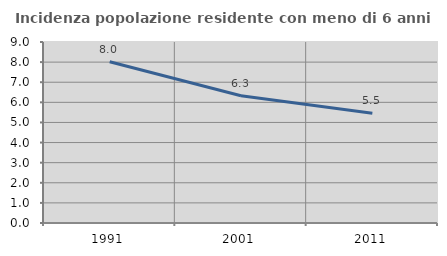
| Category | Incidenza popolazione residente con meno di 6 anni |
|---|---|
| 1991.0 | 8.019 |
| 2001.0 | 6.327 |
| 2011.0 | 5.455 |